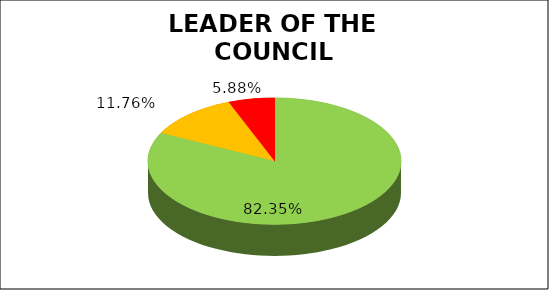
| Category | Q4 |
|---|---|
| Green | 0.824 |
| Amber | 0.118 |
| Red | 0.059 |